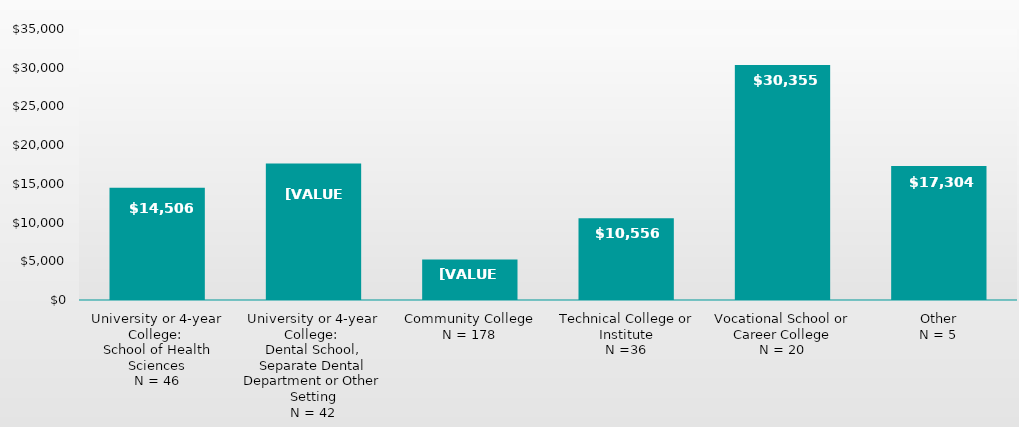
| Category | Series 0 |
|---|---|
| University or 4-year College: 
School of Health Sciences
N = 46 | 14506 |
| University or 4-year College: 
Dental School, Separate Dental Department or Other Setting
N = 42 | 17630.07 |
| Community College
N = 178 | 5232 |
| Technical College or Institute
N =36 | 10556 |
| Vocational School or Career College
N = 20 | 30355 |
| Other
N = 5 | 17304 |